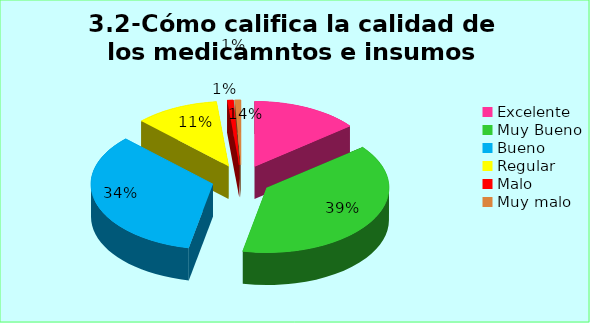
| Category | Series 0 |
|---|---|
| Excelente | 0.143 |
| Muy Bueno | 0.389 |
| Bueno  | 0.341 |
| Regular  | 0.111 |
| Malo  | 0.008 |
| Muy malo  | 0.008 |